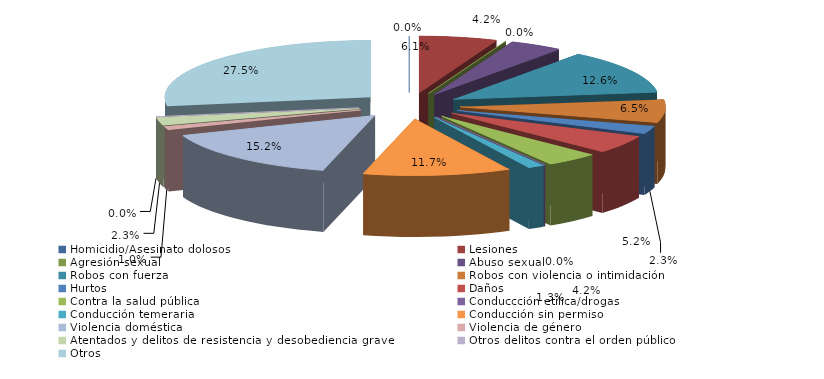
| Category | Series 0 |
|---|---|
| Homicidio/Asesinato dolosos | 0 |
| Lesiones | 19 |
| Agresión sexual | 0 |
| Abuso sexual | 13 |
| Robos con fuerza | 39 |
| Robos con violencia o intimidación | 20 |
| Hurtos | 7 |
| Daños | 16 |
| Contra la salud pública | 13 |
| Conduccción etílica/drogas | 0 |
| Conducción temeraria | 4 |
| Conducción sin permiso | 36 |
| Violencia doméstica | 47 |
| Violencia de género | 3 |
| Atentados y delitos de resistencia y desobediencia grave | 7 |
| Otros delitos contra el orden público | 0 |
| Otros | 85 |